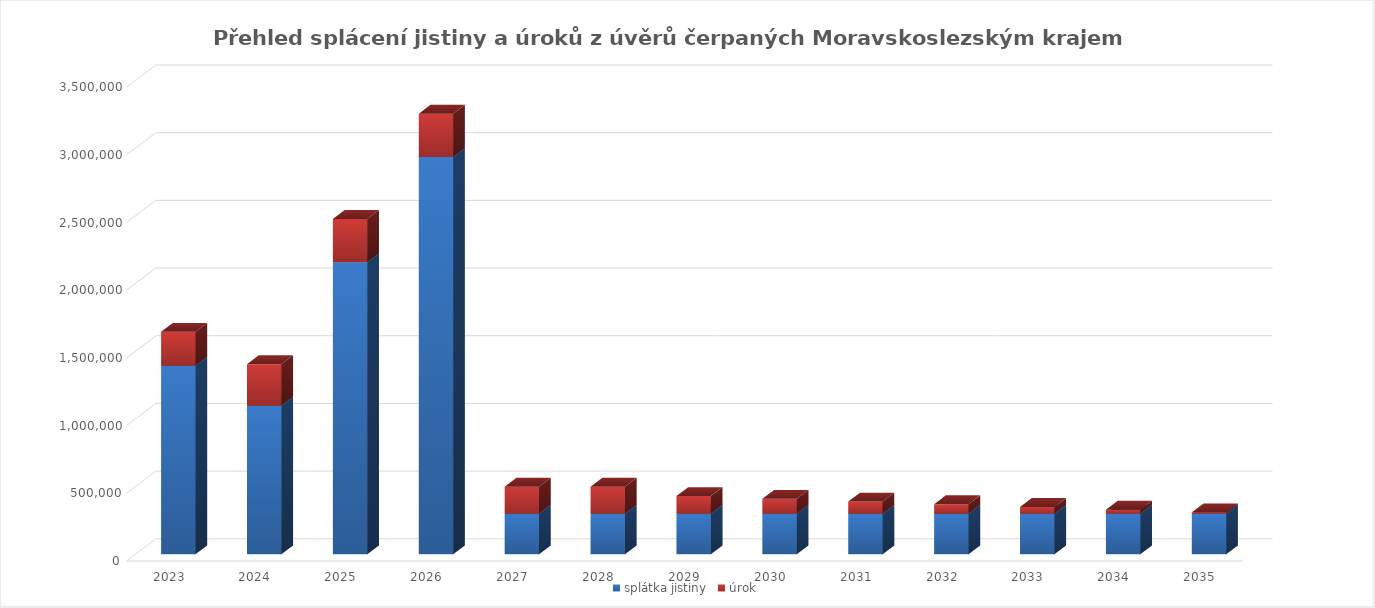
| Category | splátka jistiny | úrok |
|---|---|---|
| 2023.0 | 1394011.286 | 250000 |
| 2024.0 | 1098429.286 | 306000 |
| 2025.0 | 2157259.286 | 320500 |
| 2026.0 | 2935540 | 320000 |
| 2027.0 | 300000 | 200000 |
| 2028.0 | 300000 | 200000 |
| 2029.0 | 300000 | 130000 |
| 2030.0 | 300000 | 110000 |
| 2031.0 | 300000 | 90000 |
| 2032.0 | 300000 | 70000 |
| 2033.0 | 300000 | 50000 |
| 2034.0 | 300000 | 30000 |
| 2035.0 | 300000 | 10000 |